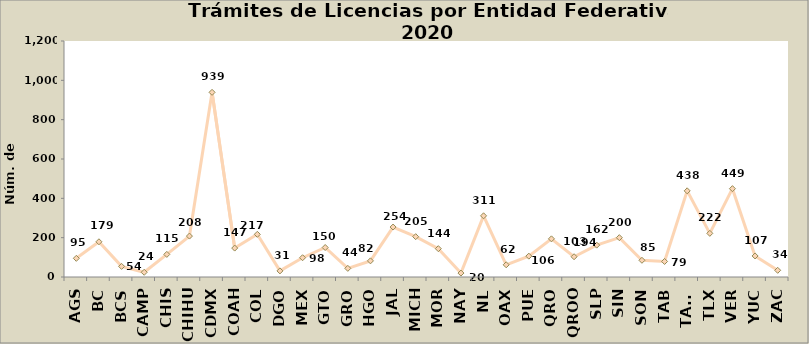
| Category | Series 0 |
|---|---|
| AGS | 95 |
| BC | 179 |
| BCS | 54 |
| CAMP | 24 |
| CHIS | 115 |
| CHIHU | 208 |
| CDMX | 939 |
| COAH | 147 |
| COL | 217 |
| DGO | 31 |
| MEX | 98 |
| GTO | 150 |
| GRO | 44 |
| HGO | 82 |
| JAL | 254 |
| MICH | 205 |
| MOR | 144 |
| NAY | 20 |
| NL | 311 |
| OAX | 62 |
| PUE | 106 |
| QRO | 194 |
| QROO | 103 |
| SLP | 162 |
| SIN | 200 |
| SON | 85 |
| TAB | 79 |
| TAMS | 438 |
| TLX | 222 |
| VER | 449 |
| YUC | 107 |
| ZAC | 34 |